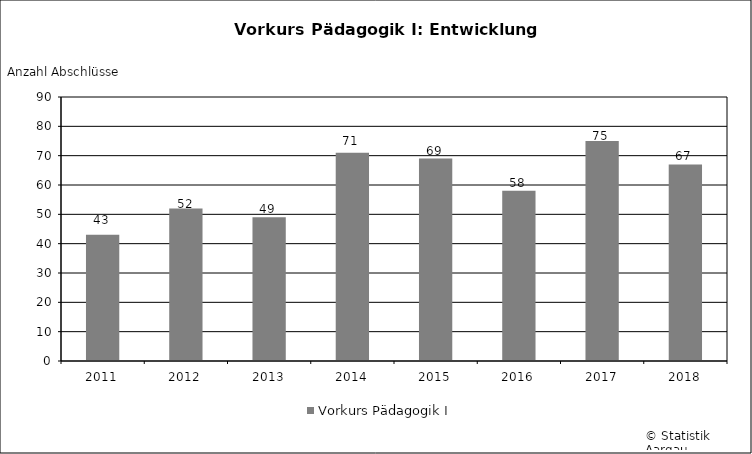
| Category | Vorkurs Pädagogik I |
|---|---|
| 2011 | 43 |
| 2012 | 52 |
| 2013 | 49 |
| 2014 | 71 |
| 2015 | 69 |
| 2016 | 58 |
| 2017 | 75 |
| 2018 | 67 |